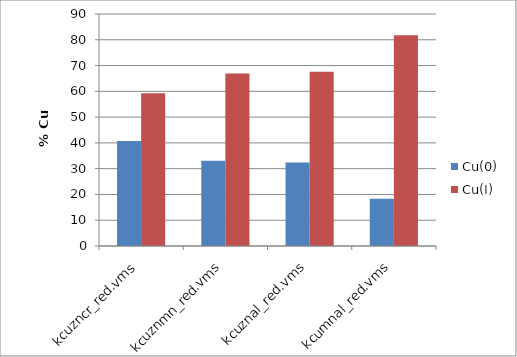
| Category | Cu(0) | Cu(I) |
|---|---|---|
| kcuzncr_red.vms | 40.71 | 59.3 |
| kcuznmn_red.vms | 33.06 | 66.94 |
| kcuznal_red.vms | 32.41 | 67.58 |
| kcumnal_red.vms | 18.3 | 81.71 |